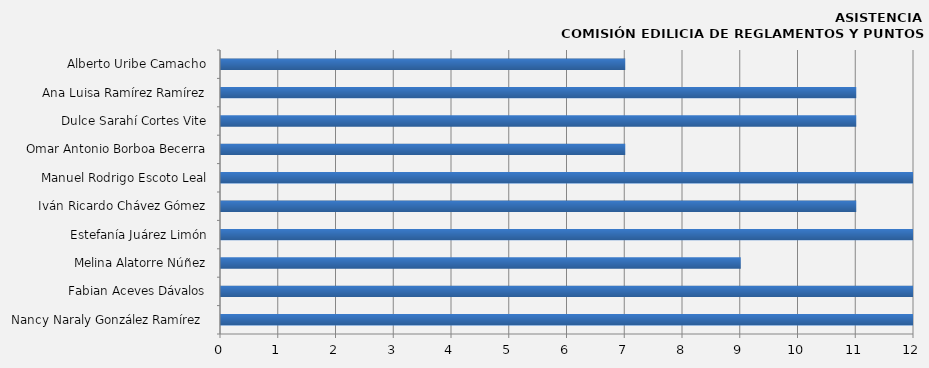
| Category | Series 0 |
|---|---|
| Nancy Naraly González Ramírez  | 13 |
| Fabian Aceves Dávalos | 13 |
| Melina Alatorre Núñez | 9 |
| Estefanía Juárez Limón | 13 |
| Iván Ricardo Chávez Gómez | 11 |
| Manuel Rodrigo Escoto Leal | 13 |
| Omar Antonio Borboa Becerra | 7 |
| Dulce Sarahí Cortes Vite | 11 |
| Ana Luisa Ramírez Ramírez | 11 |
| Alberto Uribe Camacho | 7 |